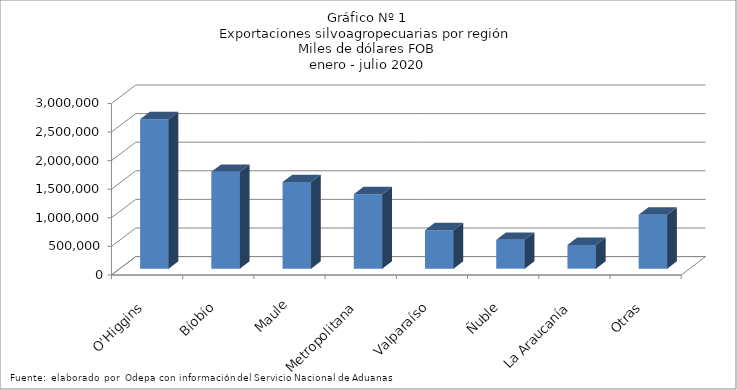
| Category | Series 0 |
|---|---|
| O'Higgins | 2614540.066 |
| Bíobío | 1694981.935 |
| Maule | 1514185.531 |
| Metropolitana | 1301902.13 |
| Valparaíso | 673338.513 |
| Ñuble | 504652.32 |
| La Araucanía | 415117.221 |
| Otras | 945030.1 |